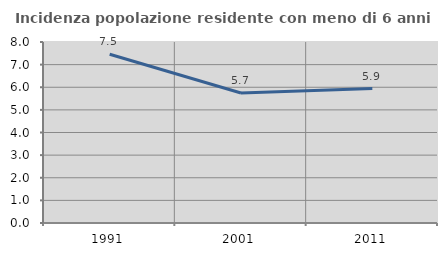
| Category | Incidenza popolazione residente con meno di 6 anni |
|---|---|
| 1991.0 | 7.456 |
| 2001.0 | 5.745 |
| 2011.0 | 5.94 |